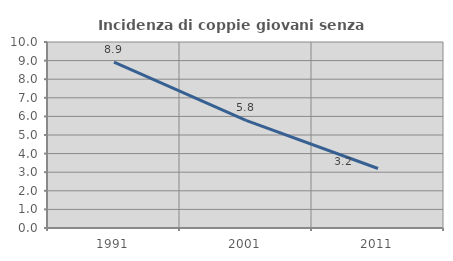
| Category | Incidenza di coppie giovani senza figli |
|---|---|
| 1991.0 | 8.92 |
| 2001.0 | 5.789 |
| 2011.0 | 3.2 |